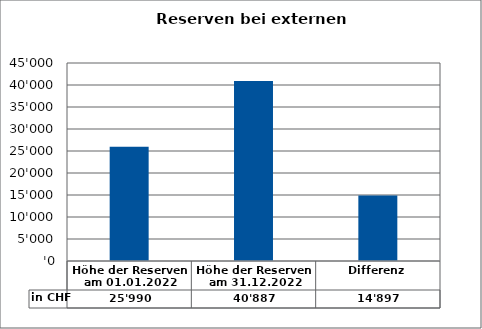
| Category | in CHF |
|---|---|
| Höhe der Reserven am 01.01.2022 | 25990.11 |
| Höhe der Reserven am 31.12.2022 | 40887.23 |
| Differenz | 14897.12 |